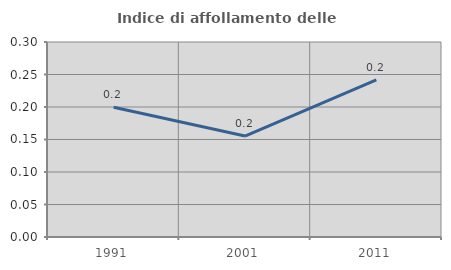
| Category | Indice di affollamento delle abitazioni  |
|---|---|
| 1991.0 | 0.2 |
| 2001.0 | 0.155 |
| 2011.0 | 0.242 |